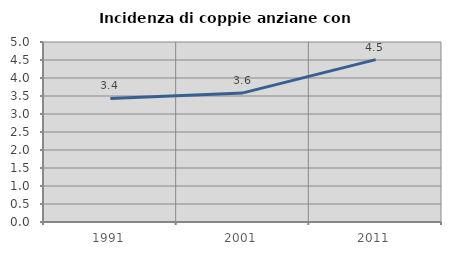
| Category | Incidenza di coppie anziane con figli |
|---|---|
| 1991.0 | 3.433 |
| 2001.0 | 3.586 |
| 2011.0 | 4.511 |